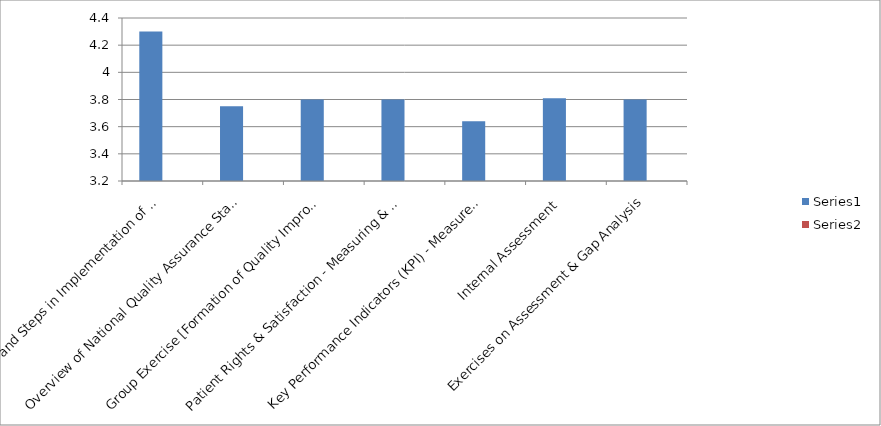
| Category | Series 0 | Series 1 |
|---|---|---|
| Principles and Steps in Implementation of Quality Assurance Programme | 4.3 |  |
| Overview of National Quality Assurance Standards and Measurement System | 3.75 |  |
| Group Exercise [Formation of Quality Improvement (QI) Team] | 3.8 |  |
| Patient Rights & Satisfaction - Measuring & Improving  | 3.8 |  |
| Key Performance Indicators (KPI) - Measurement & Analysis | 3.64 |  |
| Internal Assessment  | 3.81 |  |
| Exercises on Assessment & Gap Analysis | 3.8 |  |